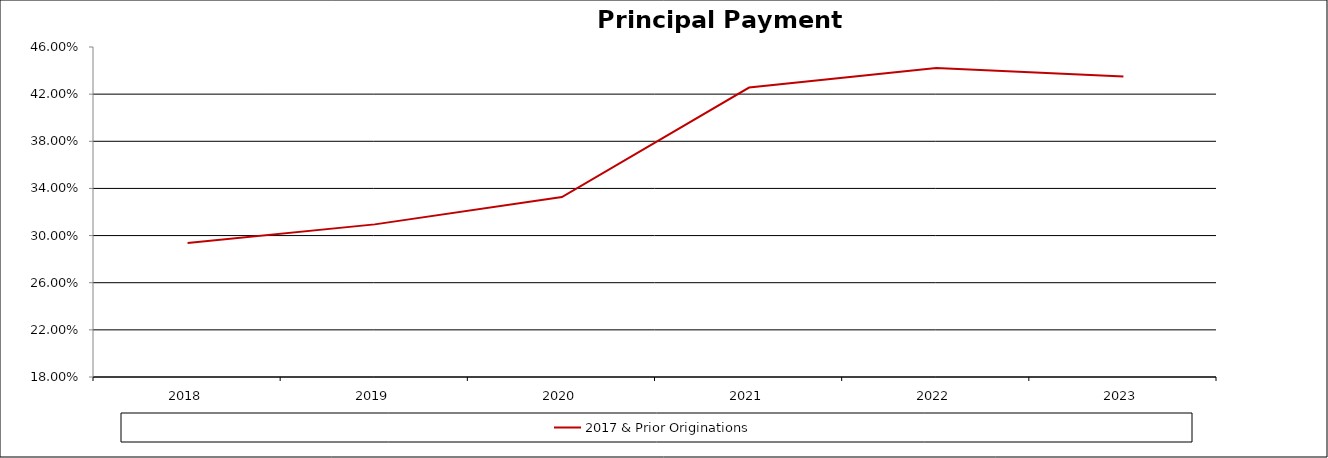
| Category | 2017 & Prior Originations |
|---|---|
| 2018 | 0.294 |
| 2019 | 0.31 |
| 2020 | 0.333 |
| 2021 | 0.426 |
| 2022 | 0.442 |
| 2023 | 0.435 |